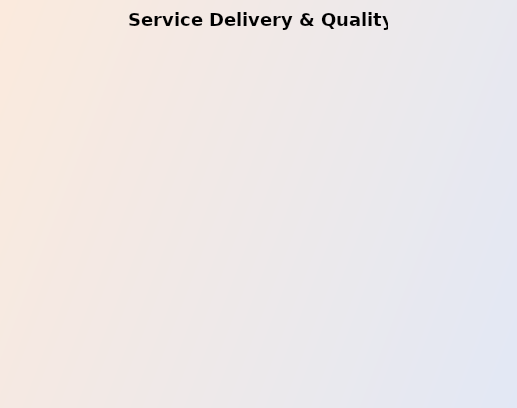
| Category | Series 0 |
|---|---|
| Information and Education about Service Delivery | 1 |
| Service Delivery Targets | 3 |
| Service Improvement and Learning | 2 |
| Service Delivery Standards | 3 |